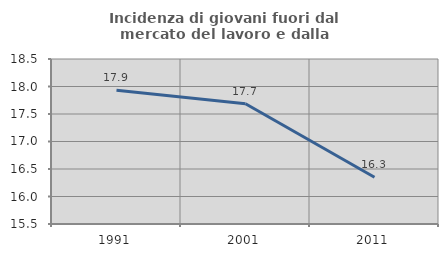
| Category | Incidenza di giovani fuori dal mercato del lavoro e dalla formazione  |
|---|---|
| 1991.0 | 17.933 |
| 2001.0 | 17.687 |
| 2011.0 | 16.349 |